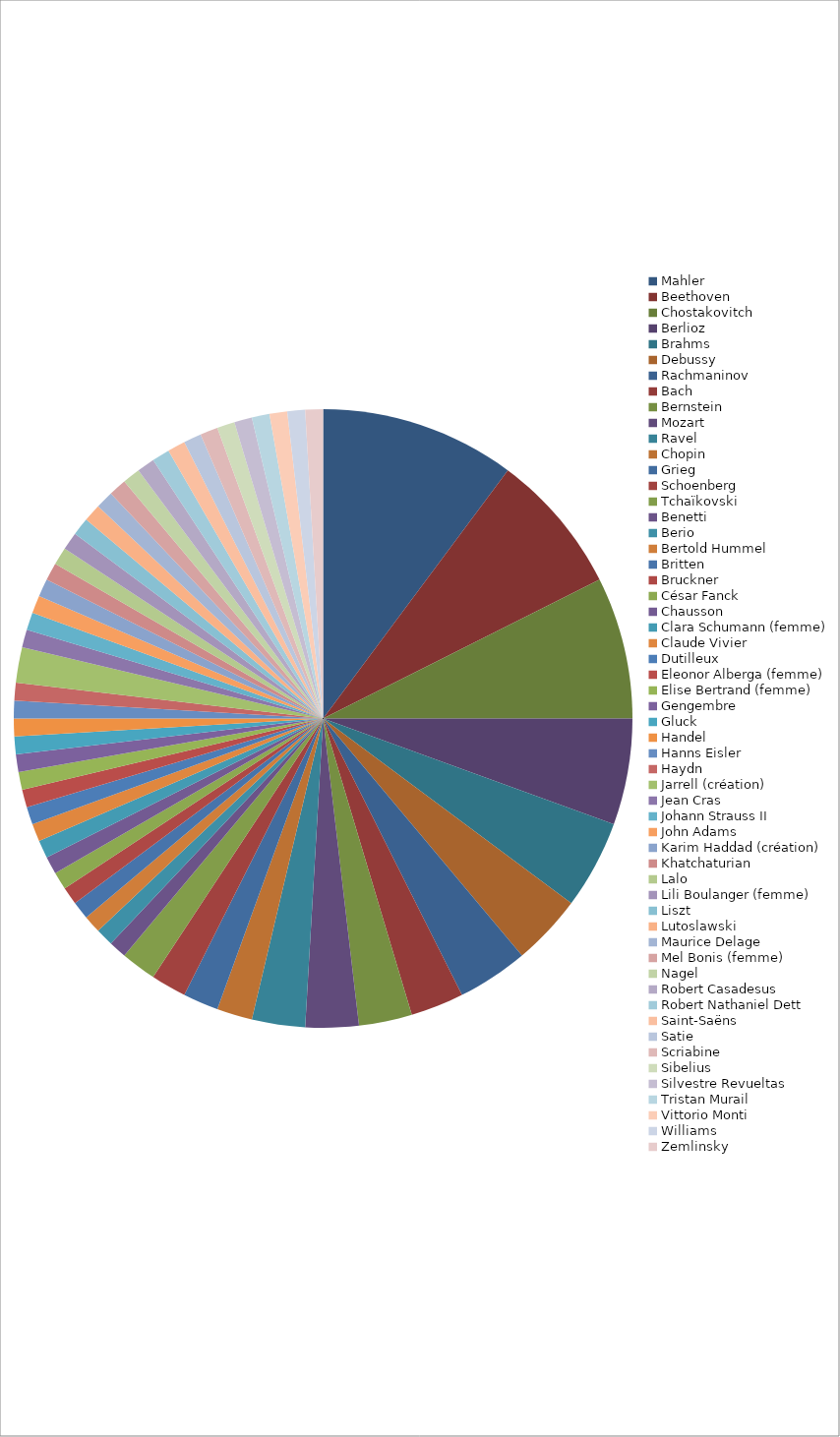
| Category | Series 0 |
|---|---|
| Mahler | 11 |
| Beethoven | 8 |
| Chostakovitch | 8 |
| Berlioz | 6 |
| Brahms | 5 |
| Debussy | 4 |
| Rachmaninov | 4 |
| Bach | 3 |
| Bernstein | 3 |
| Mozart | 3 |
| Ravel | 3 |
| Chopin | 2 |
| Grieg | 2 |
| Schoenberg | 2 |
| Tchaïkovski | 2 |
| Benetti | 1 |
| Berio | 1 |
| Bertold Hummel | 1 |
| Britten | 1 |
| Bruckner | 1 |
| César Fanck | 1 |
| Chausson | 1 |
| Clara Schumann (femme) | 1 |
| Claude Vivier | 1 |
| Dutilleux | 1 |
| Eleonor Alberga (femme) | 1 |
| Elise Bertrand (femme) | 1 |
| Gengembre | 1 |
| Gluck | 1 |
| Handel | 1 |
| Hanns Eisler | 1 |
| Haydn | 1 |
| Jarrell (création) | 2 |
| Jean Cras | 1 |
| Johann Strauss II | 1 |
| John Adams | 1 |
| Karim Haddad (création) | 1 |
| Khatchaturian | 1 |
| Lalo | 1 |
| Lili Boulanger (femme) | 1 |
| Liszt | 1 |
| Lutoslawski | 1 |
| Maurice Delage | 1 |
| Mel Bonis (femme) | 1 |
| Nagel | 1 |
| Robert Casadesus | 1 |
| Robert Nathaniel Dett | 1 |
| Saint-Saëns | 1 |
| Satie | 1 |
| Scriabine | 1 |
| Sibelius | 1 |
| Silvestre Revueltas | 1 |
| Tristan Murail | 1 |
| Vittorio Monti | 1 |
| Williams | 1 |
| Zemlinsky | 1 |